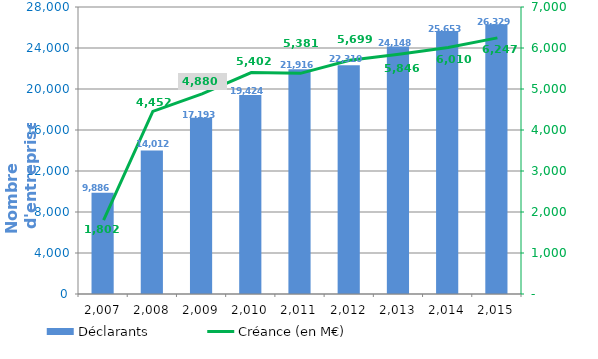
| Category | Déclarants |
|---|---|
| 2007.0 | 9886 |
| 2008.0 | 14012 |
| 2009.0 | 17193 |
| 2010.0 | 19424 |
| 2011.0 | 21916 |
| 2012.0 | 22310 |
| 2013.0 | 24148 |
| 2014.0 | 25653 |
| 2015.0 | 26329 |